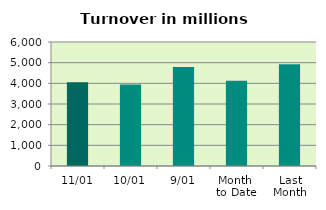
| Category | Series 0 |
|---|---|
| 11/01 | 4056.519 |
| 10/01 | 3937.85 |
| 9/01 | 4787.657 |
| Month 
to Date | 4124.829 |
| Last
Month | 4921.323 |